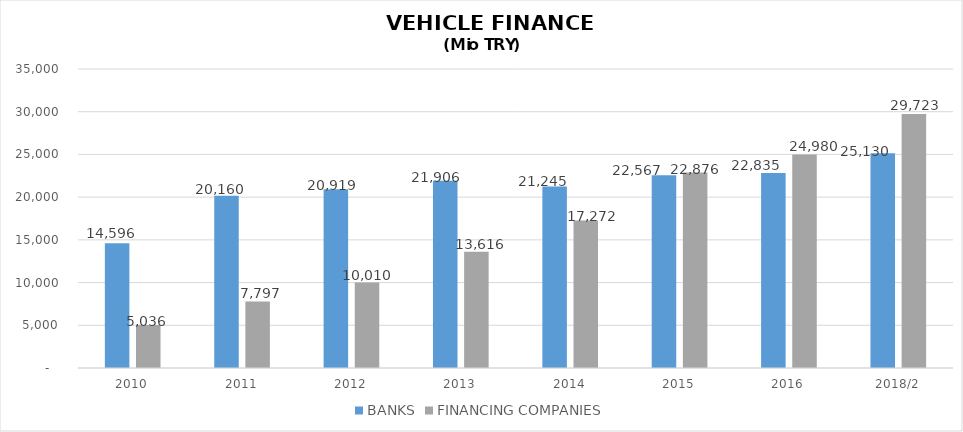
| Category | BANKS | FINANCING COMPANIES |
|---|---|---|
| 2010 | 14596 | 5035.89 |
| 2011 | 20160 | 7796.854 |
| 2012 | 20919 | 10009.755 |
| 2013 | 21906 | 13616.036 |
| 2014 | 21245 | 17271.844 |
| 2015 | 22567 | 22875.563 |
| 2016 | 22835 | 24980.231 |
| 2018/2 | 25130 | 29723.154 |